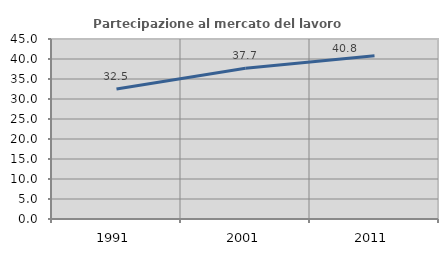
| Category | Partecipazione al mercato del lavoro  femminile |
|---|---|
| 1991.0 | 32.51 |
| 2001.0 | 37.662 |
| 2011.0 | 40.807 |